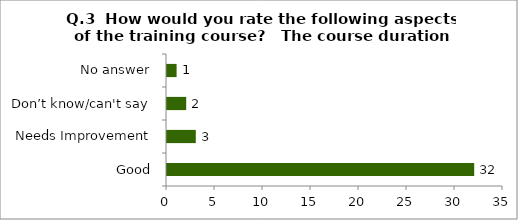
| Category | Q.3  How would you rate the following aspects of the training course?  |
|---|---|
| Good | 32 |
| Needs Improvement | 3 |
| Don’t know/can't say | 2 |
| No answer | 1 |